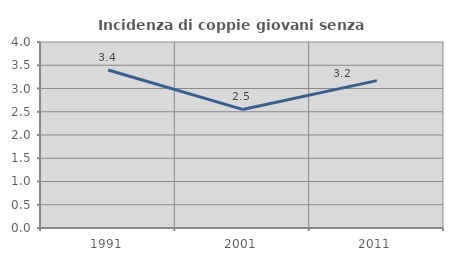
| Category | Incidenza di coppie giovani senza figli |
|---|---|
| 1991.0 | 3.398 |
| 2001.0 | 2.55 |
| 2011.0 | 3.169 |